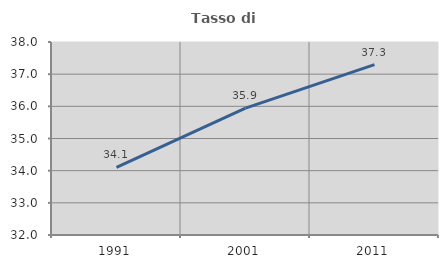
| Category | Tasso di occupazione   |
|---|---|
| 1991.0 | 34.101 |
| 2001.0 | 35.945 |
| 2011.0 | 37.299 |